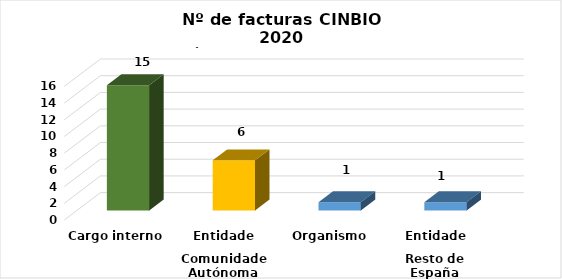
| Category | Series 0 |
|---|---|
| 0 | 15 |
| 1 | 6 |
| 2 | 1 |
| 3 | 1 |